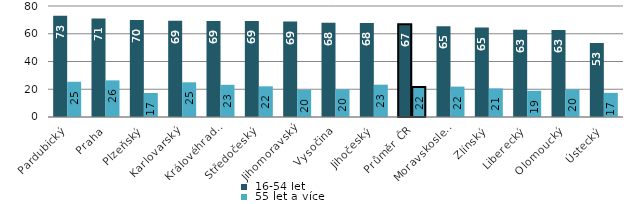
| Category |  16-54 let |  55 let a více |
|---|---|---|
| Pardubický | 73 | 25.4 |
| Praha | 71 | 26.4 |
| Plzeňský | 70 | 17.3 |
| Karlovarský | 69.4 | 25 |
| Královéhradecký | 69.2 | 23.2 |
| Středočeský | 69.1 | 22.1 |
| Jihomoravský | 68.8 | 19.6 |
| Vysočina | 67.9 | 19.9 |
| Jihočeský | 67.8 | 23.3 |
| Průměr ČR | 66.8 | 21.7 |
| Moravskoslezský | 65.4 | 21.9 |
| Zlínský | 64.5 | 20.6 |
| Liberecký | 62.9 | 18.9 |
| Olomoucký | 62.7 | 19.9 |
| Ústecký | 53.3 | 17.4 |